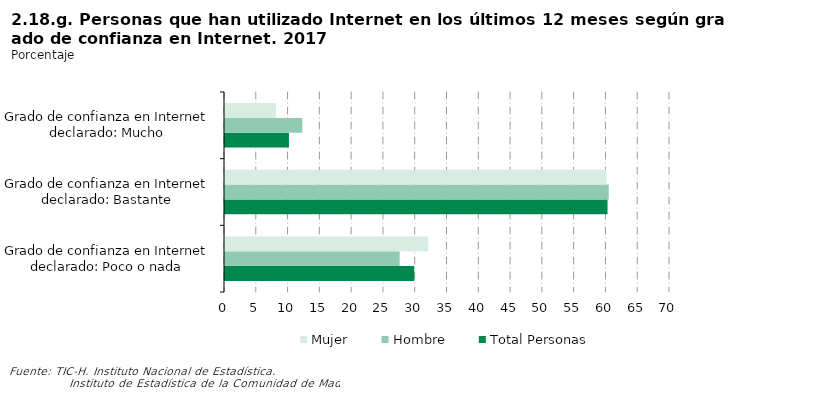
| Category | Total Personas | Hombre | Mujer |
|---|---|---|---|
| Grado de confianza en Internet declarado: Poco o nada | 29.766 | 27.473 | 31.975 |
| Grado de confianza en Internet declarado: Bastante | 60.176 | 60.366 | 59.992 |
| Grado de confianza en Internet declarado: Mucho | 10.058 | 12.161 | 8.034 |